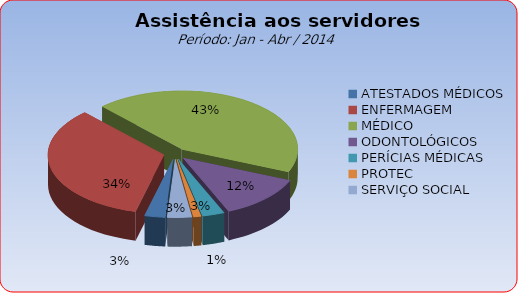
| Category | Series 0 |
|---|---|
| ATESTADOS MÉDICOS | 2.835 |
| ENFERMAGEM | 34.076 |
| MÉDICO | 43.342 |
| ODONTOLÓGICOS | 12.203 |
| PERÍCIAS MÉDICAS | 3.089 |
| PROTEC | 1.063 |
| SERVIÇO SOCIAL | 3.392 |